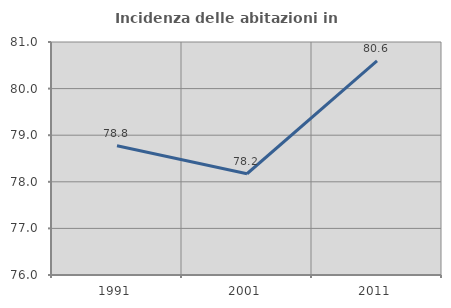
| Category | Incidenza delle abitazioni in proprietà  |
|---|---|
| 1991.0 | 78.775 |
| 2001.0 | 78.173 |
| 2011.0 | 80.593 |